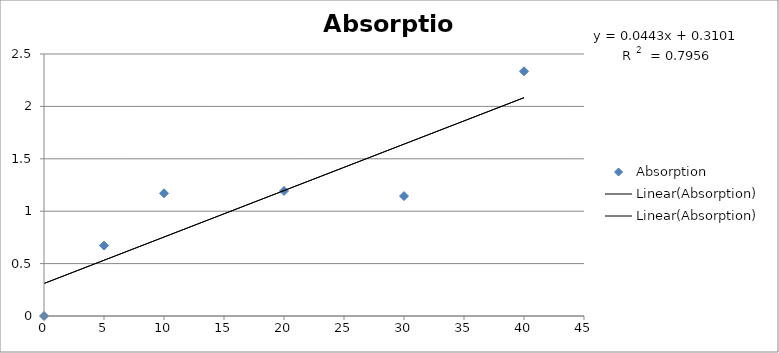
| Category | Absorption |
|---|---|
| 0.0 | 0 |
| 5.0 | 0.672 |
| 10.0 | 1.171 |
| 20.0 | 1.193 |
| 30.0 | 1.144 |
| 40.0 | 2.335 |